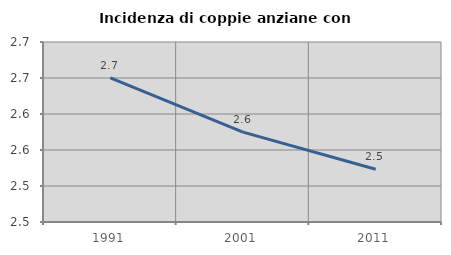
| Category | Incidenza di coppie anziane con figli |
|---|---|
| 1991.0 | 2.65 |
| 2001.0 | 2.575 |
| 2011.0 | 2.523 |